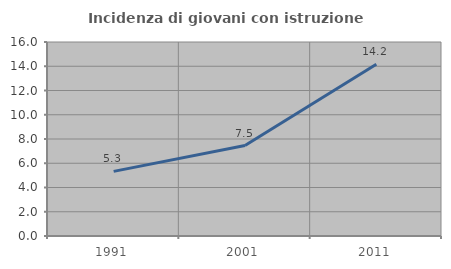
| Category | Incidenza di giovani con istruzione universitaria |
|---|---|
| 1991.0 | 5.33 |
| 2001.0 | 7.459 |
| 2011.0 | 14.167 |